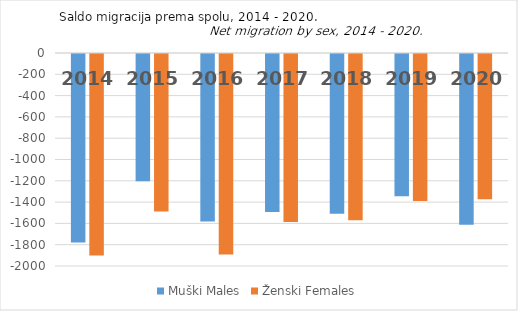
| Category | Muški Males | Ženski Females |
|---|---|---|
| 2014.0 | -1771 | -1893 |
| 2015.0 | -1195 | -1479 |
| 2016.0 | -1572 | -1883 |
| 2017.0 | -1484 | -1577 |
| 2018.0 | -1500 | -1561 |
| 2019.0 | -1336 | -1381 |
| 2020.0 | -1603 | -1365 |